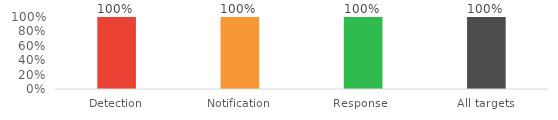
| Category | Series 0 |
|---|---|
| Detection | 1 |
| Notification | 1 |
| Response  | 1 |
| All targets | 1 |